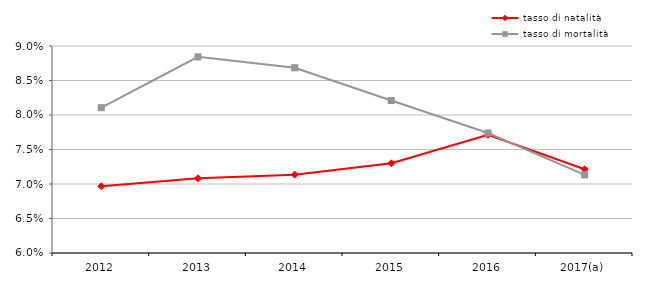
| Category | tasso di natalità | tasso di mortalità |
|---|---|---|
| 2012 | 0.07 | 0.081 |
| 2013 | 0.071 | 0.088 |
| 2014 | 0.071 | 0.087 |
| 2015 | 0.073 | 0.082 |
| 2016 | 0.077 | 0.077 |
| 2017(a) | 0.072 | 0.071 |